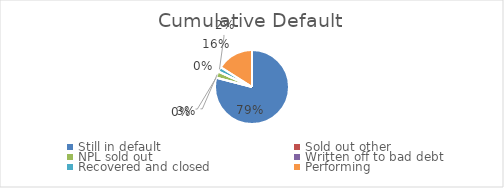
| Category | Series 0 |
|---|---|
| Still in default | 0.791 |
| Sold out other | 0 |
| NPL sold out | 0.028 |
| Written off to bad debt | 0 |
| Recovered and closed | 0.021 |
| Performing | 0.16 |